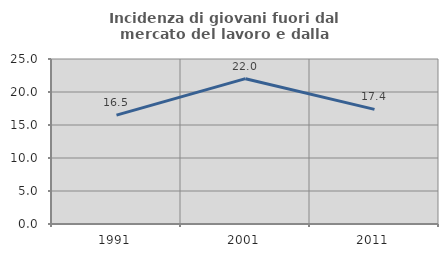
| Category | Incidenza di giovani fuori dal mercato del lavoro e dalla formazione  |
|---|---|
| 1991.0 | 16.496 |
| 2001.0 | 22.018 |
| 2011.0 | 17.366 |